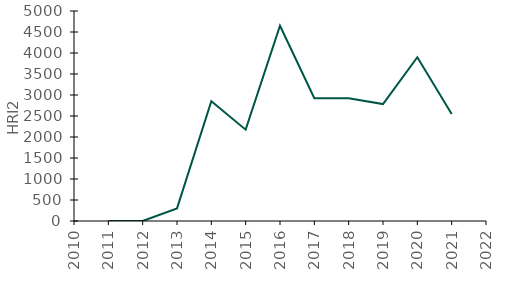
| Category | HRI2 |
|---|---|
| 2011.0 | 0 |
| 2012.0 | 0 |
| 2013.0 | 300 |
| 2014.0 | 2850 |
| 2015.0 | 2175 |
| 2016.0 | 4650 |
| 2017.0 | 2925 |
| 2018.0 | 2925 |
| 2019.0 | 2784 |
| 2020.0 | 3900 |
| 2021.0 | 2550 |